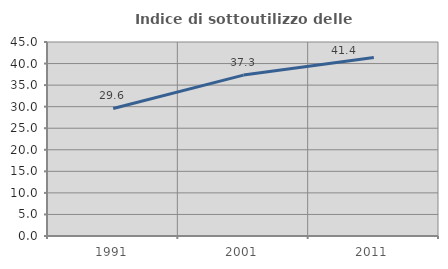
| Category | Indice di sottoutilizzo delle abitazioni  |
|---|---|
| 1991.0 | 29.58 |
| 2001.0 | 37.323 |
| 2011.0 | 41.397 |